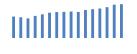
| Category | Exportações (1) |
|---|---|
| 0 | 595986.616 |
| 1 | 575965.577 |
| 2 | 544011.291 |
| 3 | 614380.205 |
| 4 | 656918.26 |
| 5 | 703504.835 |
| 6 | 720793.562 |
| 7 | 726284.803 |
| 8 | 735533.905 |
| 9 | 723973.625 |
| 10 | 778041 |
| 11 | 800341.537 |
| 12 | 819402.338 |
| 13 | 856189.676 |
| 14 | 925952.679 |
| 15 | 938781.557 |